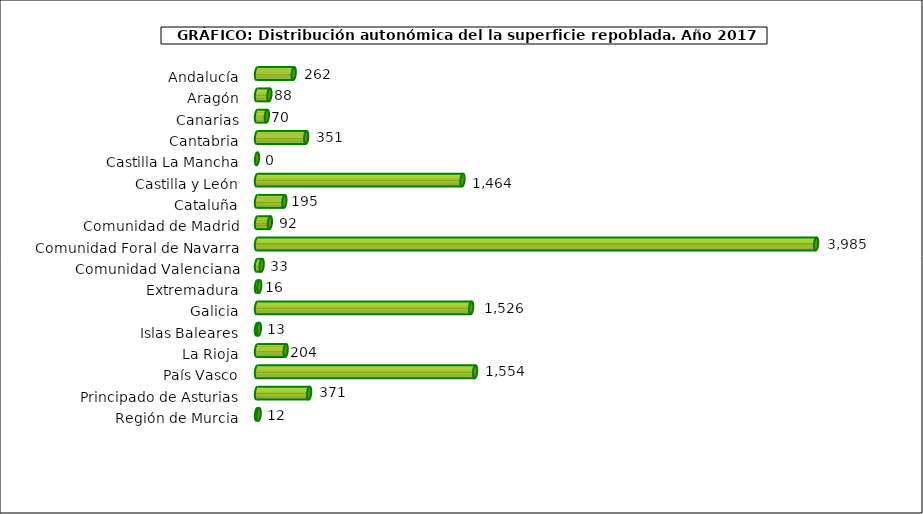
| Category | Series 1 |
|---|---|
| Andalucía | 261.63 |
| Aragón | 88.42 |
| Canarias | 70 |
| Cantabria | 350.5 |
| Castilla La Mancha | 0 |
| Castilla y León | 1464.48 |
| Cataluña | 195 |
| Comunidad de Madrid | 92 |
| Comunidad Foral de Navarra | 3984.6 |
| Comunidad Valenciana | 33.26 |
| Extremadura | 16 |
| Galicia | 1525.91 |
| Islas Baleares | 13.21 |
| La Rioja | 204.4 |
| País Vasco | 1554.11 |
| Principado de Asturias | 371.37 |
| Región de Murcia | 12 |